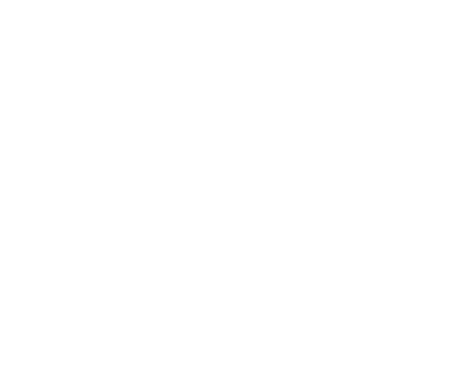
| Category | Trip Expenses |
|---|---|
| Pre travel | 0 |
| Travel  | 0 |
| Accommodation | 0 |
| Food & expendables | 0 |
| Entertainment | 0 |